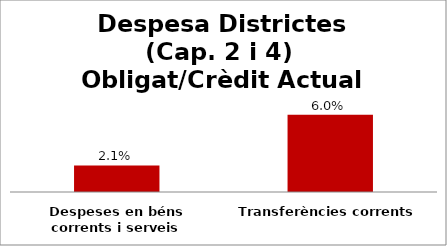
| Category | Series 0 |
|---|---|
| Despeses en béns corrents i serveis | 0.021 |
| Transferències corrents | 0.06 |